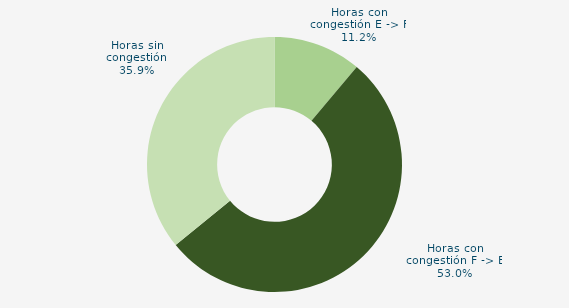
| Category | Horas con congestión E -> F |
|---|---|
| Horas con congestión E -> F | 11.156 |
| Horas con congestión F -> E | 52.957 |
| Horas sin congestión | 35.887 |